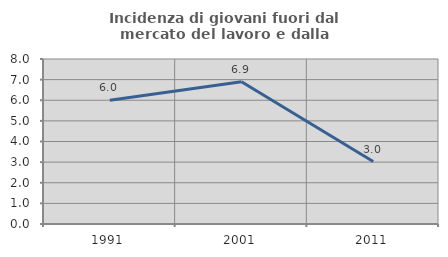
| Category | Incidenza di giovani fuori dal mercato del lavoro e dalla formazione  |
|---|---|
| 1991.0 | 6 |
| 2001.0 | 6.897 |
| 2011.0 | 3.03 |